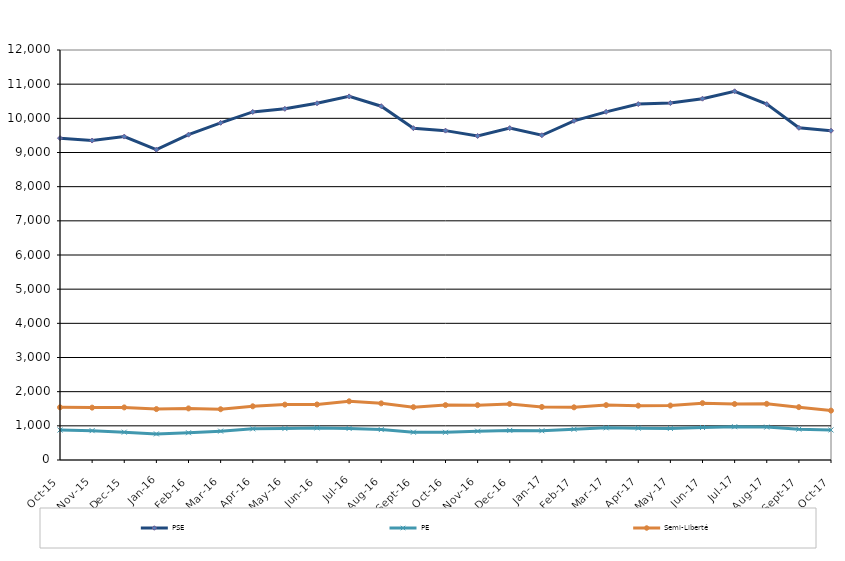
| Category | PSE | PE | Semi-Liberté |
|---|---|---|---|
| 2015-10-01 | 9420 | 877 | 1542 |
| 2015-11-01 | 9350 | 859 | 1533 |
| 2015-12-01 | 9466 | 815 | 1539 |
| 2016-01-01 | 9081 | 764 | 1490 |
| 2016-02-01 | 9521 | 798 | 1510 |
| 2016-03-01 | 9868 | 845 | 1486 |
| 2016-04-01 | 10187 | 912 | 1572 |
| 2016-05-01 | 10278 | 920 | 1621 |
| 2016-06-01 | 10441 | 939 | 1625 |
| 2016-07-01 | 10642 | 923 | 1718 |
| 2016-08-01 | 10355 | 890 | 1658 |
| 2016-09-01 | 9712 | 813 | 1546 |
| 2016-10-01 | 9640 | 809 | 1607 |
| 2016-11-01 | 9484 | 844 | 1605 |
| 2016-12-01 | 9714 | 866 | 1641 |
| 2017-01-01 | 9505 | 855 | 1553 |
| 2017-02-01 | 9927 | 900 | 1542 |
| 2017-03-01 | 10190 | 942 | 1607 |
| 2017-04-01 | 10417 | 931 | 1590 |
| 2017-05-01 | 10448 | 924 | 1594 |
| 2017-06-01 | 10575 | 951 | 1664 |
| 2017-07-01 | 10791 | 974 | 1639 |
| 2017-08-01 | 10417 | 963 | 1644 |
| 2017-09-01 | 9723 | 903 | 1547 |
| 2017-10-01 | 9637 | 879 | 1445 |